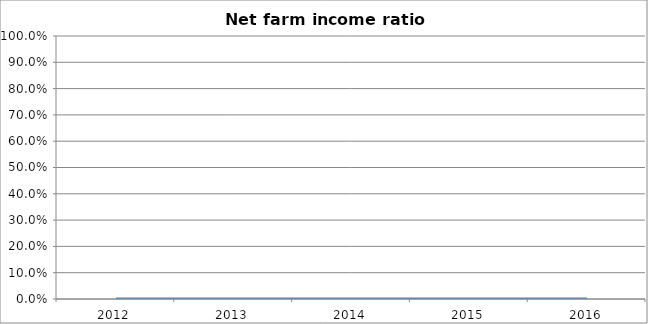
| Category | Net farm income ratio [I/H] |
|---|---|
| 2012.0 | 0 |
| 2013.0 | 0 |
| 2014.0 | 0 |
| 2015.0 | 0 |
| 2016.0 | 0 |